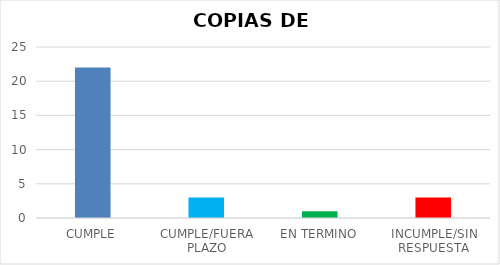
| Category | TOTAL |
|---|---|
| CUMPLE | 22 |
| CUMPLE/FUERA PLAZO | 3 |
| EN TERMINO | 1 |
| INCUMPLE/SIN RESPUESTA | 3 |